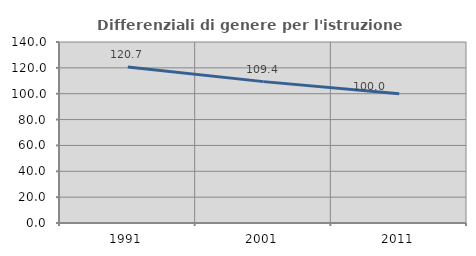
| Category | Differenziali di genere per l'istruzione superiore |
|---|---|
| 1991.0 | 120.749 |
| 2001.0 | 109.353 |
| 2011.0 | 99.996 |